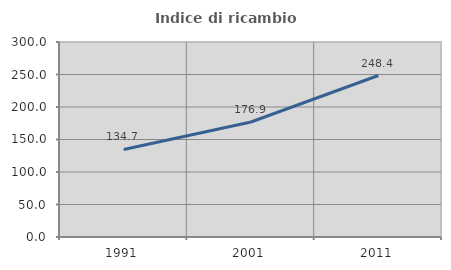
| Category | Indice di ricambio occupazionale  |
|---|---|
| 1991.0 | 134.706 |
| 2001.0 | 176.923 |
| 2011.0 | 248.438 |